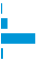
| Category | Series 0 |
|---|---|
| 0 | 0.005 |
| 1 | 0.138 |
| 2 | 0.831 |
| 3 | 0.026 |